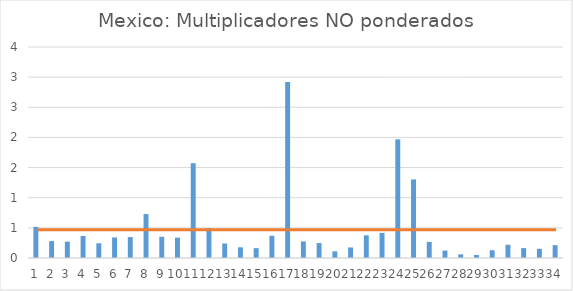
| Category | Series 0 |
|---|---|
| 0 | 0.516 |
| 1 | 0.28 |
| 2 | 0.271 |
| 3 | 0.365 |
| 4 | 0.244 |
| 5 | 0.342 |
| 6 | 0.347 |
| 7 | 0.729 |
| 8 | 0.352 |
| 9 | 0.338 |
| 10 | 1.573 |
| 11 | 0.495 |
| 12 | 0.241 |
| 13 | 0.178 |
| 14 | 0.164 |
| 15 | 0.368 |
| 16 | 2.92 |
| 17 | 0.275 |
| 18 | 0.248 |
| 19 | 0.11 |
| 20 | 0.175 |
| 21 | 0.376 |
| 22 | 0.416 |
| 23 | 1.968 |
| 24 | 1.304 |
| 25 | 0.268 |
| 26 | 0.124 |
| 27 | 0.061 |
| 28 | 0.049 |
| 29 | 0.129 |
| 30 | 0.22 |
| 31 | 0.165 |
| 32 | 0.153 |
| 33 | 0.214 |